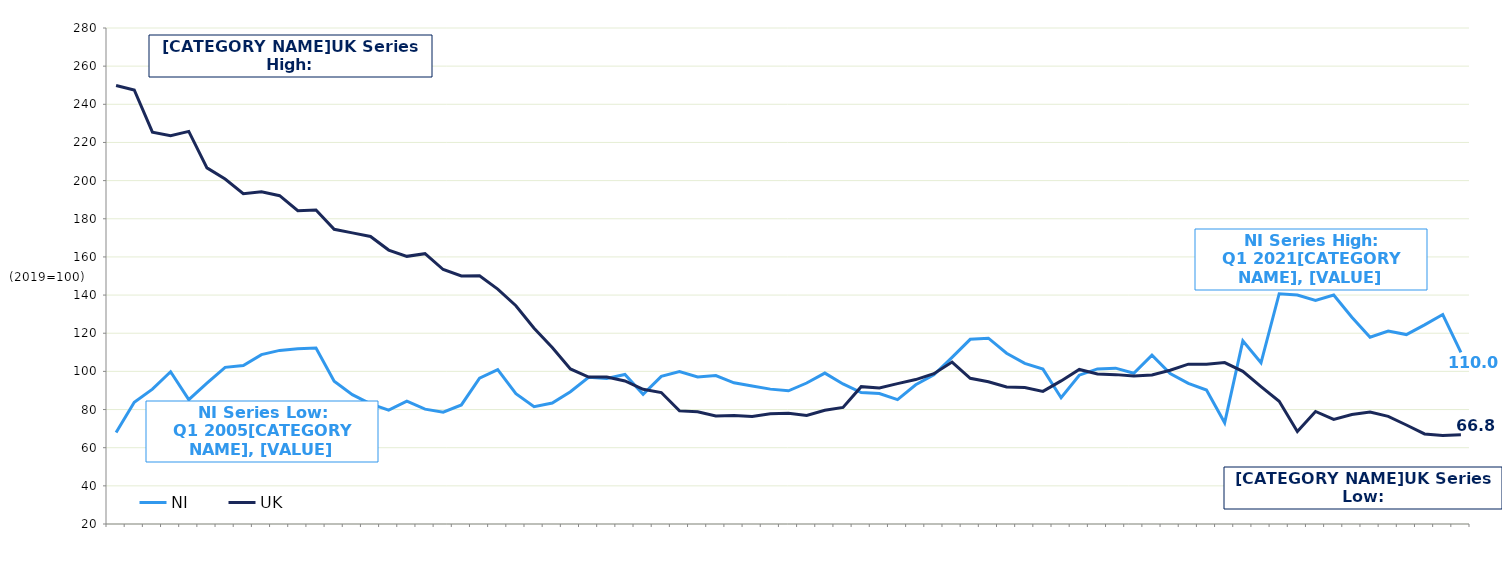
| Category | NI | UK  |
|---|---|---|
|  | 68 | 249.9 |
|  | 83.8 | 247.5 |
| Q3 2005 | 90.7 | 225.4 |
|  | 99.8 | 223.5 |
|  | 85.2 | 225.8 |
|  | 93.8 | 206.7 |
| Q3 2006 | 102.1 | 200.8 |
|  | 103.1 | 193.1 |
|  | 108.8 | 194.1 |
|  | 111 | 192.1 |
| Q3 2007 | 111.9 | 184.2 |
|  | 112.3 | 184.6 |
|  | 94.8 | 174.5 |
|  | 87.8 | 172.6 |
| Q3 2008 | 83 | 170.7 |
|  | 79.7 | 163.6 |
|  | 84.4 | 160.3 |
|  | 80.2 | 161.7 |
| Q3 2009 | 78.6 | 153.4 |
|  | 82.4 | 150 |
|  | 96.5 | 150.1 |
|  | 100.9 | 143.1 |
| Q3 2010 | 88.3 | 134.4 |
|  | 81.5 | 122.6 |
|  | 83.4 | 112.5 |
|  | 89.3 | 101.3 |
| Q3 2011 | 96.9 | 97 |
|  | 96.3 | 97 |
|  | 98.4 | 95 |
|  | 88 | 90.6 |
| Q3 2012 | 97.4 | 88.9 |
|  | 99.9 | 79.3 |
|  | 97.1 | 78.8 |
|  | 97.8 | 76.6 |
| Q3 2013 | 94 | 76.9 |
|  | 92.3 | 76.3 |
|  | 90.7 | 77.8 |
|  | 89.8 | 78.1 |
| Q3 2014 | 93.9 | 76.9 |
|  | 99.1 | 79.6 |
|  | 93.4 | 81.1 |
|  | 88.9 | 92 |
| Q3 2015 | 88.4 | 91.3 |
|  | 85.2 | 93.6 |
|  | 93 | 95.7 |
|  | 98.2 | 98.8 |
| Q3 2016 | 107.3 | 104.9 |
|  | 116.8 | 96.4 |
|  | 117.4 | 94.6 |
|  | 109.5 | 91.8 |
| Q3 2017 | 104.2 | 91.5 |
|  | 101.2 | 89.5 |
|  | 86.2 | 95 |
|  | 98 | 101 |
| Q3 2018 | 101.3 | 98.6 |
|  | 101.7 | 98.3 |
|  | 99 | 97.6 |
|  | 108.5 | 98.1 |
| Q3 2019 | 98.9 | 100.6 |
|  | 93.7 | 103.8 |
|  | 90.2 | 103.8 |
|  | 73.1 | 104.6 |
| Q3 2020 | 116 | 100 |
|  | 104.5 | 92 |
|  | 140.7 | 84.3 |
|  | 140 | 68.5 |
| Q3 2021 | 137.2 | 79 |
|  | 140 | 74.8 |
|  | 128.4 | 77.4 |
|  | 117.9 | 78.7 |
| Q3 2022 | 121.1 | 76.4 |
|  | 119.3 | 71.9 |
|  | 124.4 | 67.2 |
|  | 129.8 | 66.4 |
| Q3 2023 | 110 | 66.8 |